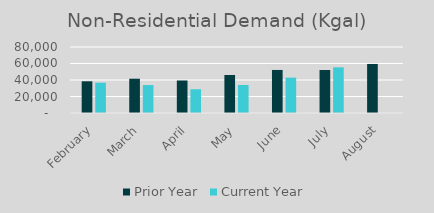
| Category | Prior Year | Current Year |
|---|---|---|
| February | 38439 | 36720 |
| March | 41545 | 33872 |
| April | 39390 | 28794 |
| May | 46068 | 33923 |
| June | 52164 | 42862 |
| July | 52094 | 55350 |
| August | 59449 | 0 |